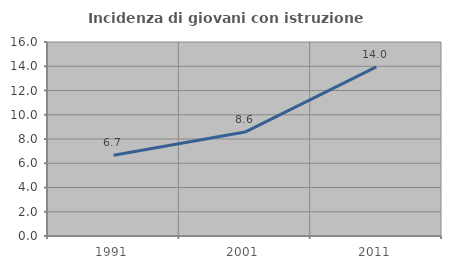
| Category | Incidenza di giovani con istruzione universitaria |
|---|---|
| 1991.0 | 6.667 |
| 2001.0 | 8.571 |
| 2011.0 | 13.953 |